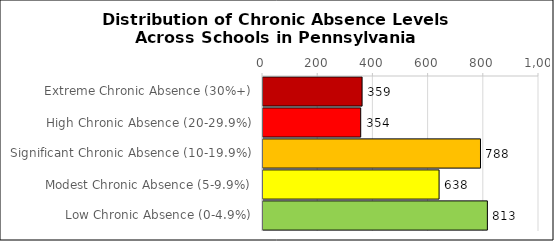
| Category | Number of Schools |
|---|---|
| Extreme Chronic Absence (30%+) | 359 |
| High Chronic Absence (20-29.9%) | 354 |
| Significant Chronic Absence (10-19.9%) | 788 |
| Modest Chronic Absence (5-9.9%) | 638 |
| Low Chronic Absence (0-4.9%) | 813 |